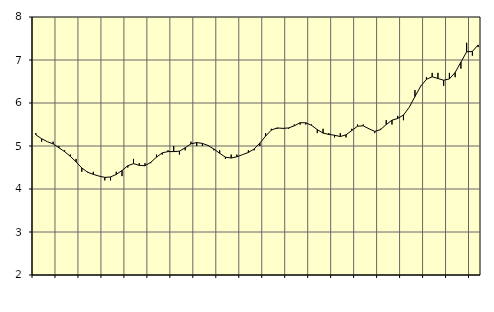
| Category | Piggar | Information och kommunikation, SNI 58-63 |
|---|---|---|
| nan | 5.3 | 5.26 |
| 1.0 | 5.1 | 5.17 |
| 1.0 | 5.1 | 5.1 |
| 1.0 | 5.1 | 5.05 |
| nan | 5 | 4.96 |
| 2.0 | 4.9 | 4.87 |
| 2.0 | 4.8 | 4.76 |
| 2.0 | 4.7 | 4.63 |
| nan | 4.4 | 4.49 |
| 3.0 | 4.4 | 4.39 |
| 3.0 | 4.4 | 4.34 |
| 3.0 | 4.3 | 4.3 |
| nan | 4.2 | 4.27 |
| 4.0 | 4.2 | 4.28 |
| 4.0 | 4.4 | 4.34 |
| 4.0 | 4.3 | 4.43 |
| nan | 4.5 | 4.54 |
| 5.0 | 4.7 | 4.59 |
| 5.0 | 4.6 | 4.55 |
| 5.0 | 4.6 | 4.54 |
| nan | 4.6 | 4.62 |
| 6.0 | 4.8 | 4.74 |
| 6.0 | 4.8 | 4.84 |
| 6.0 | 4.9 | 4.87 |
| nan | 5 | 4.87 |
| 7.0 | 4.8 | 4.88 |
| 7.0 | 4.9 | 4.96 |
| 7.0 | 5.1 | 5.05 |
| nan | 5 | 5.08 |
| 8.0 | 5 | 5.06 |
| 8.0 | 5 | 5.01 |
| 8.0 | 4.9 | 4.93 |
| nan | 4.9 | 4.83 |
| 9.0 | 4.7 | 4.74 |
| 9.0 | 4.8 | 4.72 |
| 9.0 | 4.8 | 4.75 |
| nan | 4.8 | 4.8 |
| 10.0 | 4.9 | 4.85 |
| 10.0 | 4.9 | 4.93 |
| 10.0 | 5 | 5.07 |
| nan | 5.3 | 5.23 |
| 11.0 | 5.4 | 5.37 |
| 11.0 | 5.4 | 5.42 |
| 11.0 | 5.4 | 5.41 |
| nan | 5.4 | 5.42 |
| 12.0 | 5.5 | 5.47 |
| 12.0 | 5.5 | 5.54 |
| 12.0 | 5.5 | 5.54 |
| nan | 5.5 | 5.48 |
| 13.0 | 5.3 | 5.38 |
| 13.0 | 5.4 | 5.3 |
| 13.0 | 5.3 | 5.27 |
| nan | 5.2 | 5.25 |
| 14.0 | 5.3 | 5.22 |
| 14.0 | 5.2 | 5.26 |
| 14.0 | 5.4 | 5.36 |
| nan | 5.5 | 5.46 |
| 15.0 | 5.5 | 5.47 |
| 15.0 | 5.4 | 5.4 |
| 15.0 | 5.3 | 5.34 |
| nan | 5.4 | 5.38 |
| 16.0 | 5.6 | 5.5 |
| 16.0 | 5.5 | 5.6 |
| 16.0 | 5.7 | 5.64 |
| nan | 5.6 | 5.72 |
| 17.0 | 5.9 | 5.9 |
| 17.0 | 6.3 | 6.15 |
| 17.0 | 6.4 | 6.39 |
| nan | 6.6 | 6.55 |
| 18.0 | 6.7 | 6.61 |
| 18.0 | 6.7 | 6.57 |
| 18.0 | 6.4 | 6.53 |
| nan | 6.7 | 6.56 |
| 19.0 | 6.6 | 6.71 |
| 19.0 | 6.8 | 6.95 |
| 19.0 | 7.4 | 7.19 |
| nan | 7.1 | 7.2 |
| 20.0 | 7.3 | 7.35 |